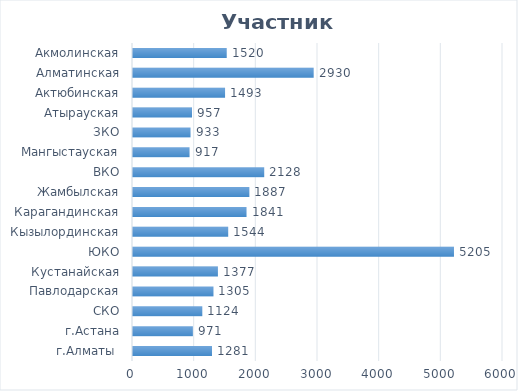
| Category | Series 0 |
|---|---|
| г.Алматы  | 1281 |
| г.Астана | 971 |
| СКО | 1124 |
| Павлодарская | 1305 |
| Кустанайская | 1377 |
| ЮКО | 5205 |
| Кызылординская | 1544 |
| Карагандинская | 1841 |
| Жамбылская | 1887 |
| ВКО | 2128 |
| Мангыстауская | 917 |
| ЗКО | 933 |
| Атырауская | 957 |
| Актюбинская | 1493 |
| Алматинская | 2930 |
| Акмолинская | 1520 |